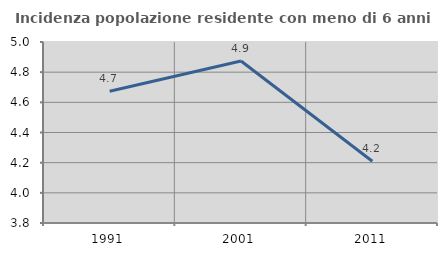
| Category | Incidenza popolazione residente con meno di 6 anni |
|---|---|
| 1991.0 | 4.673 |
| 2001.0 | 4.874 |
| 2011.0 | 4.209 |